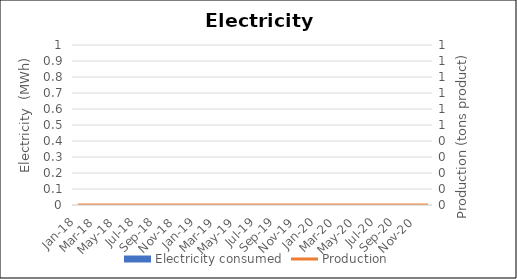
| Category | Electricity consumed |
|---|---|
| Jan-18 | 0 |
| Feb-18 | 0 |
| Mar-18 | 0 |
| Apr-18 | 0 |
| May-18 | 0 |
| Jun-18 | 0 |
| Jul-18 | 0 |
| Aug-18 | 0 |
| Sep-18 | 0 |
| Oct-18 | 0 |
| Nov-18 | 0 |
| Dec-18 | 0 |
| Jan-19 | 0 |
| Feb-19 | 0 |
| Mar-19 | 0 |
| Apr-19 | 0 |
| May-19 | 0 |
| Jun-19 | 0 |
| Jul-19 | 0 |
| Aug-19 | 0 |
| Sep-19 | 0 |
| Oct-19 | 0 |
| Nov-19 | 0 |
| Dec-19 | 0 |
| Jan-20 | 0 |
| Feb-20 | 0 |
| Mar-20 | 0 |
| Apr-20 | 0 |
| May-20 | 0 |
| Jun-20 | 0 |
| Jul-20 | 0 |
| Aug-20 | 0 |
| Sep-20 | 0 |
| Oct-20 | 0 |
| Nov-20 | 0 |
| Dec-20 | 0 |